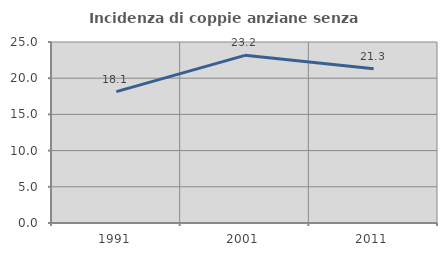
| Category | Incidenza di coppie anziane senza figli  |
|---|---|
| 1991.0 | 18.142 |
| 2001.0 | 23.16 |
| 2011.0 | 21.3 |